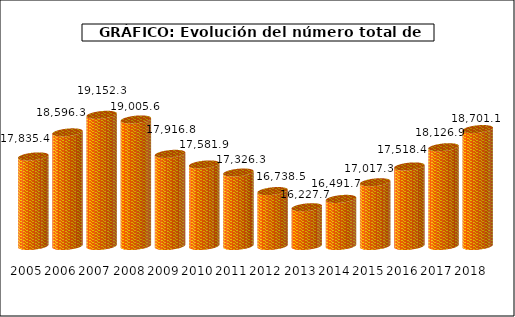
| Category | Series1 |
|---|---|
| 2005.0 | 17835.4 |
| 2006.0 | 18596.3 |
| 2007.0 | 19152.3 |
| 2008.0 | 19005.6 |
| 2009.0 | 17916.8 |
| 2010.0 | 17581.9 |
| 2011.0 | 17326.3 |
| 2012.0 | 16738.5 |
| 2013.0 | 16227.7 |
| 2014.0 | 16491.7 |
| 2015.0 | 17017.3 |
| 2016.0 | 17518.4 |
| 2017.0 | 18126.9 |
| 2018.0 | 18701.1 |